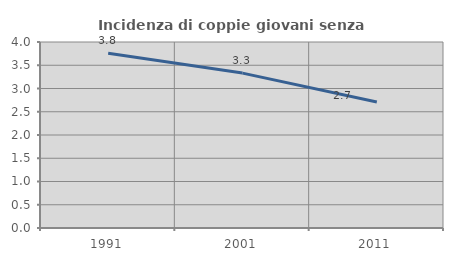
| Category | Incidenza di coppie giovani senza figli |
|---|---|
| 1991.0 | 3.757 |
| 2001.0 | 3.331 |
| 2011.0 | 2.709 |